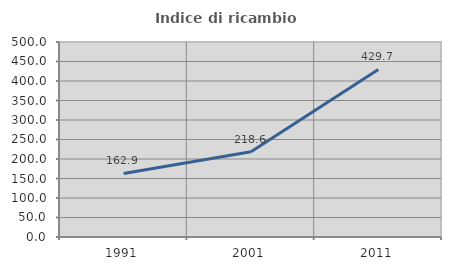
| Category | Indice di ricambio occupazionale  |
|---|---|
| 1991.0 | 162.948 |
| 2001.0 | 218.592 |
| 2011.0 | 429.748 |